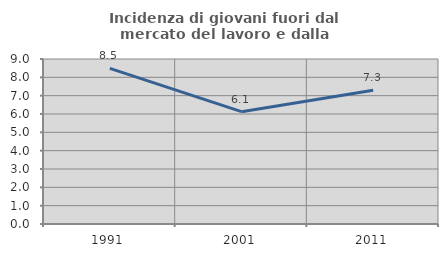
| Category | Incidenza di giovani fuori dal mercato del lavoro e dalla formazione  |
|---|---|
| 1991.0 | 8.489 |
| 2001.0 | 6.127 |
| 2011.0 | 7.295 |